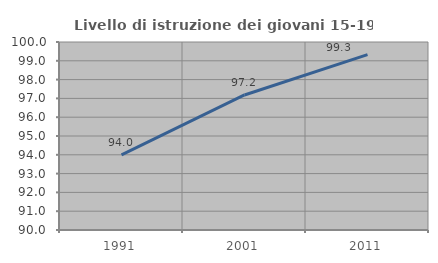
| Category | Livello di istruzione dei giovani 15-19 anni |
|---|---|
| 1991.0 | 94 |
| 2001.0 | 97.183 |
| 2011.0 | 99.329 |